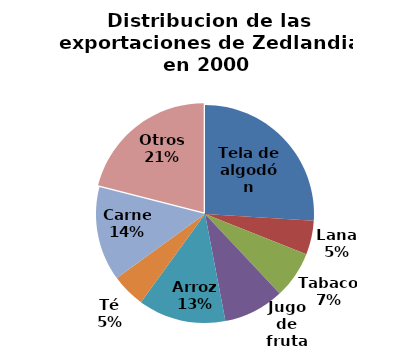
| Category | Distribucion de las exportaciones de Zedlandia en 2000 |
|---|---|
| Tela de algodón | 0.26 |
| Lana | 0.05 |
| Tabaco | 0.07 |
| Jugo de fruta | 0.09 |
| Arroz | 0.13 |
| Té | 0.05 |
| Carne | 0.14 |
| Otros | 0.21 |